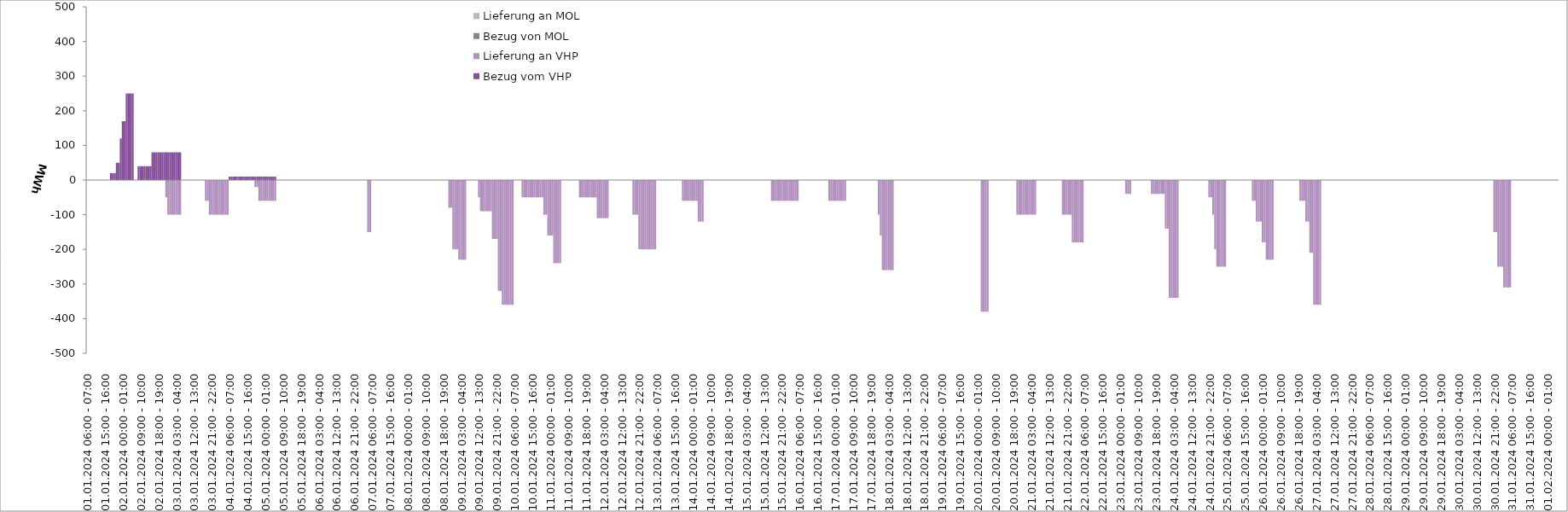
| Category | Bezug vom VHP | Lieferung an VHP | Bezug von MOL | Lieferung an MOL |
|---|---|---|---|---|
| 01.01.2024 06:00 - 07:00 | 0 | 0 | 0 | 0 |
| 01.01.2024 07:00 - 08:00 | 0 | 0 | 0 | 0 |
| 01.01.2024 08:00 - 09:00 | 0 | 0 | 0 | 0 |
| 01.01.2024 09:00 - 10:00 | 0 | 0 | 0 | 0 |
| 01.01.2024 10:00 - 11:00 | 0 | 0 | 0 | 0 |
| 01.01.2024 11:00 - 12:00 | 0 | 0 | 0 | 0 |
| 01.01.2024 12:00 - 13:00 | 0 | 0 | 0 | 0 |
| 01.01.2024 13:00 - 14:00 | 0 | 0 | 0 | 0 |
| 01.01.2024 14:00 - 15:00 | 0 | 0 | 0 | 0 |
| 01.01.2024 15:00 - 16:00 | 0 | 0 | 0 | 0 |
| 01.01.2024 16:00 - 17:00 | 0 | 0 | 0 | 0 |
| 01.01.2024 17:00 - 18:00 | 0 | 0 | 0 | 0 |
| 01.01.2024 18:00 - 19:00 | 20 | 0 | 0 | 0 |
| 01.01.2024 19:00 - 20:00 | 20 | 0 | 0 | 0 |
| 01.01.2024 20:00 - 21:00 | 20 | 0 | 0 | 0 |
| 01.01.2024 21:00 - 22:00 | 50 | 0 | 0 | 0 |
| 01.01.2024 22:00 - 23:00 | 50 | 0 | 0 | 0 |
| 01.01.2024 23:00 - 24:00 | 120 | 0 | 0 | 0 |
| 02.01.2024 00:00 - 01:00 | 170 | 0 | 0 | 0 |
| 02.01.2024 01:00 - 02:00 | 170 | 0 | 0 | 0 |
| 02.01.2024 02:00 - 03:00 | 250 | 0 | 0 | 0 |
| 02.01.2024 03:00 - 04:00 | 250 | 0 | 0 | 0 |
| 02.01.2024 04:00 - 05:00 | 250 | 0 | 0 | 0 |
| 02.01.2024 05:00 - 06:00 | 250 | 0 | 0 | 0 |
| 02.01.2024 06:00 - 07:00 | 0 | 0 | 0 | 0 |
| 02.01.2024 07:00 - 08:00 | 0 | 0 | 0 | 0 |
| 02.01.2024 08:00 - 09:00 | 40 | 0 | 0 | 0 |
| 02.01.2024 09:00 - 10:00 | 40 | 0 | 0 | 0 |
| 02.01.2024 10:00 - 11:00 | 40 | 0 | 0 | 0 |
| 02.01.2024 11:00 - 12:00 | 40 | 0 | 0 | 0 |
| 02.01.2024 12:00 - 13:00 | 40 | 0 | 0 | 0 |
| 02.01.2024 13:00 - 14:00 | 40 | 0 | 0 | 0 |
| 02.01.2024 14:00 - 15:00 | 40 | 0 | 0 | 0 |
| 02.01.2024 15:00 - 16:00 | 80 | 0 | 0 | 0 |
| 02.01.2024 16:00 - 17:00 | 80 | 0 | 0 | 0 |
| 02.01.2024 17:00 - 18:00 | 80 | 0 | 0 | 0 |
| 02.01.2024 18:00 - 19:00 | 80 | 0 | 0 | 0 |
| 02.01.2024 19:00 - 20:00 | 80 | 0 | 0 | 0 |
| 02.01.2024 20:00 - 21:00 | 80 | 0 | 0 | 0 |
| 02.01.2024 21:00 - 22:00 | 80 | 0 | 0 | 0 |
| 02.01.2024 22:00 - 23:00 | 80 | -50 | 0 | 0 |
| 02.01.2024 23:00 - 24:00 | 80 | -100 | 0 | 0 |
| 03.01.2024 00:00 - 01:00 | 80 | -100 | 0 | 0 |
| 03.01.2024 01:00 - 02:00 | 80 | -100 | 0 | 0 |
| 03.01.2024 02:00 - 03:00 | 80 | -100 | 0 | 0 |
| 03.01.2024 03:00 - 04:00 | 80 | -100 | 0 | 0 |
| 03.01.2024 04:00 - 05:00 | 80 | -100 | 0 | 0 |
| 03.01.2024 05:00 - 06:00 | 80 | -100 | 0 | 0 |
| 03.01.2024 06:00 - 07:00 | 0 | 0 | 0 | 0 |
| 03.01.2024 07:00 - 08:00 | 0 | 0 | 0 | 0 |
| 03.01.2024 08:00 - 09:00 | 0 | 0 | 0 | 0 |
| 03.01.2024 09:00 - 10:00 | 0 | 0 | 0 | 0 |
| 03.01.2024 10:00 - 11:00 | 0 | 0 | 0 | 0 |
| 03.01.2024 11:00 - 12:00 | 0 | 0 | 0 | 0 |
| 03.01.2024 12:00 - 13:00 | 0 | 0 | 0 | 0 |
| 03.01.2024 13:00 - 14:00 | 0 | 0 | 0 | 0 |
| 03.01.2024 14:00 - 15:00 | 0 | 0 | 0 | 0 |
| 03.01.2024 15:00 - 16:00 | 0 | 0 | 0 | 0 |
| 03.01.2024 16:00 - 17:00 | 0 | 0 | 0 | 0 |
| 03.01.2024 17:00 - 18:00 | 0 | 0 | 0 | 0 |
| 03.01.2024 18:00 - 19:00 | 0 | -60 | 0 | 0 |
| 03.01.2024 19:00 - 20:00 | 0 | -60 | 0 | 0 |
| 03.01.2024 20:00 - 21:00 | 0 | -100 | 0 | 0 |
| 03.01.2024 21:00 - 22:00 | 0 | -100 | 0 | 0 |
| 03.01.2024 22:00 - 23:00 | 0 | -100 | 0 | 0 |
| 03.01.2024 23:00 - 24:00 | 0 | -100 | 0 | 0 |
| 04.01.2024 00:00 - 01:00 | 0 | -100 | 0 | 0 |
| 04.01.2024 01:00 - 02:00 | 0 | -100 | 0 | 0 |
| 04.01.2024 02:00 - 03:00 | 0 | -100 | 0 | 0 |
| 04.01.2024 03:00 - 04:00 | 0 | -100 | 0 | 0 |
| 04.01.2024 04:00 - 05:00 | 0 | -100 | 0 | 0 |
| 04.01.2024 05:00 - 06:00 | 0 | -100 | 0 | 0 |
| 04.01.2024 06:00 - 07:00 | 10 | 0 | 0 | 0 |
| 04.01.2024 07:00 - 08:00 | 10 | 0 | 0 | 0 |
| 04.01.2024 08:00 - 09:00 | 10 | 0 | 0 | 0 |
| 04.01.2024 09:00 - 10:00 | 10 | 0 | 0 | 0 |
| 04.01.2024 10:00 - 11:00 | 10 | 0 | 0 | 0 |
| 04.01.2024 11:00 - 12:00 | 10 | 0 | 0 | 0 |
| 04.01.2024 12:00 - 13:00 | 10 | 0 | 0 | 0 |
| 04.01.2024 13:00 - 14:00 | 10 | 0 | 0 | 0 |
| 04.01.2024 14:00 - 15:00 | 10 | 0 | 0 | 0 |
| 04.01.2024 15:00 - 16:00 | 10 | 0 | 0 | 0 |
| 04.01.2024 16:00 - 17:00 | 10 | 0 | 0 | 0 |
| 04.01.2024 17:00 - 18:00 | 10 | 0 | 0 | 0 |
| 04.01.2024 18:00 - 19:00 | 10 | 0 | 0 | 0 |
| 04.01.2024 19:00 - 20:00 | 10 | -20 | 0 | 0 |
| 04.01.2024 20:00 - 21:00 | 10 | -20 | 0 | 0 |
| 04.01.2024 21:00 - 22:00 | 10 | -60 | 0 | 0 |
| 04.01.2024 22:00 - 23:00 | 10 | -60 | 0 | 0 |
| 04.01.2024 23:00 - 24:00 | 10 | -60 | 0 | 0 |
| 05.01.2024 00:00 - 01:00 | 10 | -60 | 0 | 0 |
| 05.01.2024 01:00 - 02:00 | 10 | -60 | 0 | 0 |
| 05.01.2024 02:00 - 03:00 | 10 | -60 | 0 | 0 |
| 05.01.2024 03:00 - 04:00 | 10 | -60 | 0 | 0 |
| 05.01.2024 04:00 - 05:00 | 10 | -60 | 0 | 0 |
| 05.01.2024 05:00 - 06:00 | 10 | -60 | 0 | 0 |
| 05.01.2024 06:00 - 07:00 | 0 | 0 | 0 | 0 |
| 05.01.2024 07:00 - 08:00 | 0 | 0 | 0 | 0 |
| 05.01.2024 08:00 - 09:00 | 0 | 0 | 0 | 0 |
| 05.01.2024 09:00 - 10:00 | 0 | 0 | 0 | 0 |
| 05.01.2024 10:00 - 11:00 | 0 | 0 | 0 | 0 |
| 05.01.2024 11:00 - 12:00 | 0 | 0 | 0 | 0 |
| 05.01.2024 12:00 - 13:00 | 0 | 0 | 0 | 0 |
| 05.01.2024 13:00 - 14:00 | 0 | 0 | 0 | 0 |
| 05.01.2024 14:00 - 15:00 | 0 | 0 | 0 | 0 |
| 05.01.2024 15:00 - 16:00 | 0 | 0 | 0 | 0 |
| 05.01.2024 16:00 - 17:00 | 0 | 0 | 0 | 0 |
| 05.01.2024 17:00 - 18:00 | 0 | 0 | 0 | 0 |
| 05.01.2024 18:00 - 19:00 | 0 | 0 | 0 | 0 |
| 05.01.2024 19:00 - 20:00 | 0 | 0 | 0 | 0 |
| 05.01.2024 20:00 - 21:00 | 0 | 0 | 0 | 0 |
| 05.01.2024 21:00 - 22:00 | 0 | 0 | 0 | 0 |
| 05.01.2024 22:00 - 23:00 | 0 | 0 | 0 | 0 |
| 05.01.2024 23:00 - 24:00 | 0 | 0 | 0 | 0 |
| 06.01.2024 00:00 - 01:00 | 0 | 0 | 0 | 0 |
| 06.01.2024 01:00 - 02:00 | 0 | 0 | 0 | 0 |
| 06.01.2024 02:00 - 03:00 | 0 | 0 | 0 | 0 |
| 06.01.2024 03:00 - 04:00 | 0 | 0 | 0 | 0 |
| 06.01.2024 04:00 - 05:00 | 0 | 0 | 0 | 0 |
| 06.01.2024 05:00 - 06:00 | 0 | 0 | 0 | 0 |
| 06.01.2024 06:00 - 07:00 | 0 | 0 | 0 | 0 |
| 06.01.2024 07:00 - 08:00 | 0 | 0 | 0 | 0 |
| 06.01.2024 08:00 - 09:00 | 0 | 0 | 0 | 0 |
| 06.01.2024 09:00 - 10:00 | 0 | 0 | 0 | 0 |
| 06.01.2024 10:00 - 11:00 | 0 | 0 | 0 | 0 |
| 06.01.2024 11:00 - 12:00 | 0 | 0 | 0 | 0 |
| 06.01.2024 12:00 - 13:00 | 0 | 0 | 0 | 0 |
| 06.01.2024 13:00 - 14:00 | 0 | 0 | 0 | 0 |
| 06.01.2024 14:00 - 15:00 | 0 | 0 | 0 | 0 |
| 06.01.2024 15:00 - 16:00 | 0 | 0 | 0 | 0 |
| 06.01.2024 16:00 - 17:00 | 0 | 0 | 0 | 0 |
| 06.01.2024 17:00 - 18:00 | 0 | 0 | 0 | 0 |
| 06.01.2024 18:00 - 19:00 | 0 | 0 | 0 | 0 |
| 06.01.2024 19:00 - 20:00 | 0 | 0 | 0 | 0 |
| 06.01.2024 20:00 - 21:00 | 0 | 0 | 0 | 0 |
| 06.01.2024 21:00 - 22:00 | 0 | 0 | 0 | 0 |
| 06.01.2024 22:00 - 23:00 | 0 | 0 | 0 | 0 |
| 06.01.2024 23:00 - 24:00 | 0 | 0 | 0 | 0 |
| 07.01.2024 00:00 - 01:00 | 0 | 0 | 0 | 0 |
| 07.01.2024 01:00 - 02:00 | 0 | 0 | 0 | 0 |
| 07.01.2024 02:00 - 03:00 | 0 | 0 | 0 | 0 |
| 07.01.2024 03:00 - 04:00 | 0 | 0 | 0 | 0 |
| 07.01.2024 04:00 - 05:00 | 0 | -150 | 0 | 0 |
| 07.01.2024 05:00 - 06:00 | 0 | -150 | 0 | 0 |
| 07.01.2024 06:00 - 07:00 | 0 | 0 | 0 | 0 |
| 07.01.2024 07:00 - 08:00 | 0 | 0 | 0 | 0 |
| 07.01.2024 08:00 - 09:00 | 0 | 0 | 0 | 0 |
| 07.01.2024 09:00 - 10:00 | 0 | 0 | 0 | 0 |
| 07.01.2024 10:00 - 11:00 | 0 | 0 | 0 | 0 |
| 07.01.2024 11:00 - 12:00 | 0 | 0 | 0 | 0 |
| 07.01.2024 12:00 - 13:00 | 0 | 0 | 0 | 0 |
| 07.01.2024 13:00 - 14:00 | 0 | 0 | 0 | 0 |
| 07.01.2024 14:00 - 15:00 | 0 | 0 | 0 | 0 |
| 07.01.2024 15:00 - 16:00 | 0 | 0 | 0 | 0 |
| 07.01.2024 16:00 - 17:00 | 0 | 0 | 0 | 0 |
| 07.01.2024 17:00 - 18:00 | 0 | 0 | 0 | 0 |
| 07.01.2024 18:00 - 19:00 | 0 | 0 | 0 | 0 |
| 07.01.2024 19:00 - 20:00 | 0 | 0 | 0 | 0 |
| 07.01.2024 20:00 - 21:00 | 0 | 0 | 0 | 0 |
| 07.01.2024 21:00 - 22:00 | 0 | 0 | 0 | 0 |
| 07.01.2024 22:00 - 23:00 | 0 | 0 | 0 | 0 |
| 07.01.2024 23:00 - 24:00 | 0 | 0 | 0 | 0 |
| 08.01.2024 00:00 - 01:00 | 0 | 0 | 0 | 0 |
| 08.01.2024 01:00 - 02:00 | 0 | 0 | 0 | 0 |
| 08.01.2024 02:00 - 03:00 | 0 | 0 | 0 | 0 |
| 08.01.2024 03:00 - 04:00 | 0 | 0 | 0 | 0 |
| 08.01.2024 04:00 - 05:00 | 0 | 0 | 0 | 0 |
| 08.01.2024 05:00 - 06:00 | 0 | 0 | 0 | 0 |
| 08.01.2024 06:00 - 07:00 | 0 | 0 | 0 | 0 |
| 08.01.2024 07:00 - 08:00 | 0 | 0 | 0 | 0 |
| 08.01.2024 08:00 - 09:00 | 0 | 0 | 0 | 0 |
| 08.01.2024 09:00 - 10:00 | 0 | 0 | 0 | 0 |
| 08.01.2024 10:00 - 11:00 | 0 | 0 | 0 | 0 |
| 08.01.2024 11:00 - 12:00 | 0 | 0 | 0 | 0 |
| 08.01.2024 12:00 - 13:00 | 0 | 0 | 0 | 0 |
| 08.01.2024 13:00 - 14:00 | 0 | 0 | 0 | 0 |
| 08.01.2024 14:00 - 15:00 | 0 | 0 | 0 | 0 |
| 08.01.2024 15:00 - 16:00 | 0 | 0 | 0 | 0 |
| 08.01.2024 16:00 - 17:00 | 0 | 0 | 0 | 0 |
| 08.01.2024 17:00 - 18:00 | 0 | 0 | 0 | 0 |
| 08.01.2024 18:00 - 19:00 | 0 | 0 | 0 | 0 |
| 08.01.2024 19:00 - 20:00 | 0 | 0 | 0 | 0 |
| 08.01.2024 20:00 - 21:00 | 0 | 0 | 0 | 0 |
| 08.01.2024 21:00 - 22:00 | 0 | -80 | 0 | 0 |
| 08.01.2024 22:00 - 23:00 | 0 | -80 | 0 | 0 |
| 08.01.2024 23:00 - 24:00 | 0 | -200 | 0 | 0 |
| 09.01.2024 00:00 - 01:00 | 0 | -200 | 0 | 0 |
| 09.01.2024 01:00 - 02:00 | 0 | -200 | 0 | 0 |
| 09.01.2024 02:00 - 03:00 | 0 | -230 | 0 | 0 |
| 09.01.2024 03:00 - 04:00 | 0 | -230 | 0 | 0 |
| 09.01.2024 04:00 - 05:00 | 0 | -230 | 0 | 0 |
| 09.01.2024 05:00 - 06:00 | 0 | -230 | 0 | 0 |
| 09.01.2024 06:00 - 07:00 | 0 | 0 | 0 | 0 |
| 09.01.2024 07:00 - 08:00 | 0 | 0 | 0 | 0 |
| 09.01.2024 08:00 - 09:00 | 0 | 0 | 0 | 0 |
| 09.01.2024 09:00 - 10:00 | 0 | 0 | 0 | 0 |
| 09.01.2024 10:00 - 11:00 | 0 | 0 | 0 | 0 |
| 09.01.2024 11:00 - 12:00 | 0 | 0 | 0 | 0 |
| 09.01.2024 12:00 - 13:00 | 0 | -50 | 0 | 0 |
| 09.01.2024 13:00 - 14:00 | 0 | -90 | 0 | 0 |
| 09.01.2024 14:00 - 15:00 | 0 | -90 | 0 | 0 |
| 09.01.2024 15:00 - 16:00 | 0 | -90 | 0 | 0 |
| 09.01.2024 16:00 - 17:00 | 0 | -90 | 0 | 0 |
| 09.01.2024 17:00 - 18:00 | 0 | -90 | 0 | 0 |
| 09.01.2024 18:00 - 19:00 | 0 | -90 | 0 | 0 |
| 09.01.2024 19:00 - 20:00 | 0 | -170 | 0 | 0 |
| 09.01.2024 20:00 - 21:00 | 0 | -170 | 0 | 0 |
| 09.01.2024 21:00 - 22:00 | 0 | -170 | 0 | 0 |
| 09.01.2024 22:00 - 23:00 | 0 | -320 | 0 | 0 |
| 09.01.2024 23:00 - 24:00 | 0 | -320 | 0 | 0 |
| 10.01.2024 00:00 - 01:00 | 0 | -360 | 0 | 0 |
| 10.01.2024 01:00 - 02:00 | 0 | -360 | 0 | 0 |
| 10.01.2024 02:00 - 03:00 | 0 | -360 | 0 | 0 |
| 10.01.2024 03:00 - 04:00 | 0 | -360 | 0 | 0 |
| 10.01.2024 04:00 - 05:00 | 0 | -360 | 0 | 0 |
| 10.01.2024 05:00 - 06:00 | 0 | -360 | 0 | 0 |
| 10.01.2024 06:00 - 07:00 | 0 | 0 | 0 | 0 |
| 10.01.2024 07:00 - 08:00 | 0 | 0 | 0 | 0 |
| 10.01.2024 08:00 - 09:00 | 0 | 0 | 0 | 0 |
| 10.01.2024 09:00 - 10:00 | 0 | 0 | 0 | 0 |
| 10.01.2024 10:00 - 11:00 | 0 | -50 | 0 | 0 |
| 10.01.2024 11:00 - 12:00 | 0 | -50 | 0 | 0 |
| 10.01.2024 12:00 - 13:00 | 0 | -50 | 0 | 0 |
| 10.01.2024 13:00 - 14:00 | 0 | -50 | 0 | 0 |
| 10.01.2024 14:00 - 15:00 | 0 | -50 | 0 | 0 |
| 10.01.2024 15:00 - 16:00 | 0 | -50 | 0 | 0 |
| 10.01.2024 16:00 - 17:00 | 0 | -50 | 0 | 0 |
| 10.01.2024 17:00 - 18:00 | 0 | -50 | 0 | 0 |
| 10.01.2024 18:00 - 19:00 | 0 | -50 | 0 | 0 |
| 10.01.2024 19:00 - 20:00 | 0 | -50 | 0 | 0 |
| 10.01.2024 20:00 - 21:00 | 0 | -50 | 0 | 0 |
| 10.01.2024 21:00 - 22:00 | 0 | -100 | 0 | 0 |
| 10.01.2024 22:00 - 23:00 | 0 | -100 | 0 | 0 |
| 10.01.2024 23:00 - 24:00 | 0 | -160 | 0 | 0 |
| 11.01.2024 00:00 - 01:00 | 0 | -160 | 0 | 0 |
| 11.01.2024 01:00 - 02:00 | 0 | -160 | 0 | 0 |
| 11.01.2024 02:00 - 03:00 | 0 | -240 | 0 | 0 |
| 11.01.2024 03:00 - 04:00 | 0 | -240 | 0 | 0 |
| 11.01.2024 04:00 - 05:00 | 0 | -240 | 0 | 0 |
| 11.01.2024 05:00 - 06:00 | 0 | -240 | 0 | 0 |
| 11.01.2024 06:00 - 07:00 | 0 | 0 | 0 | 0 |
| 11.01.2024 07:00 - 08:00 | 0 | 0 | 0 | 0 |
| 11.01.2024 08:00 - 09:00 | 0 | 0 | 0 | 0 |
| 11.01.2024 09:00 - 10:00 | 0 | 0 | 0 | 0 |
| 11.01.2024 10:00 - 11:00 | 0 | 0 | 0 | 0 |
| 11.01.2024 11:00 - 12:00 | 0 | 0 | 0 | 0 |
| 11.01.2024 12:00 - 13:00 | 0 | 0 | 0 | 0 |
| 11.01.2024 13:00 - 14:00 | 0 | 0 | 0 | 0 |
| 11.01.2024 14:00 - 15:00 | 0 | 0 | 0 | 0 |
| 11.01.2024 15:00 - 16:00 | 0 | -50 | 0 | 0 |
| 11.01.2024 16:00 - 17:00 | 0 | -50 | 0 | 0 |
| 11.01.2024 17:00 - 18:00 | 0 | -50 | 0 | 0 |
| 11.01.2024 18:00 - 19:00 | 0 | -50 | 0 | 0 |
| 11.01.2024 19:00 - 20:00 | 0 | -50 | 0 | 0 |
| 11.01.2024 20:00 - 21:00 | 0 | -50 | 0 | 0 |
| 11.01.2024 21:00 - 22:00 | 0 | -50 | 0 | 0 |
| 11.01.2024 22:00 - 23:00 | 0 | -50 | 0 | 0 |
| 11.01.2024 23:00 - 24:00 | 0 | -50 | 0 | 0 |
| 12.01.2024 00:00 - 01:00 | 0 | -110 | 0 | 0 |
| 12.01.2024 01:00 - 02:00 | 0 | -110 | 0 | 0 |
| 12.01.2024 02:00 - 03:00 | 0 | -110 | 0 | 0 |
| 12.01.2024 03:00 - 04:00 | 0 | -110 | 0 | 0 |
| 12.01.2024 04:00 - 05:00 | 0 | -110 | 0 | 0 |
| 12.01.2024 05:00 - 06:00 | 0 | -110 | 0 | 0 |
| 12.01.2024 06:00 - 07:00 | 0 | 0 | 0 | 0 |
| 12.01.2024 07:00 - 08:00 | 0 | 0 | 0 | 0 |
| 12.01.2024 08:00 - 09:00 | 0 | 0 | 0 | 0 |
| 12.01.2024 09:00 - 10:00 | 0 | 0 | 0 | 0 |
| 12.01.2024 10:00 - 11:00 | 0 | 0 | 0 | 0 |
| 12.01.2024 11:00 - 12:00 | 0 | 0 | 0 | 0 |
| 12.01.2024 12:00 - 13:00 | 0 | 0 | 0 | 0 |
| 12.01.2024 13:00 - 14:00 | 0 | 0 | 0 | 0 |
| 12.01.2024 14:00 - 15:00 | 0 | 0 | 0 | 0 |
| 12.01.2024 15:00 - 16:00 | 0 | 0 | 0 | 0 |
| 12.01.2024 16:00 - 17:00 | 0 | 0 | 0 | 0 |
| 12.01.2024 17:00 - 18:00 | 0 | 0 | 0 | 0 |
| 12.01.2024 18:00 - 19:00 | 0 | -100 | 0 | 0 |
| 12.01.2024 19:00 - 20:00 | 0 | -100 | 0 | 0 |
| 12.01.2024 20:00 - 21:00 | 0 | -100 | 0 | 0 |
| 12.01.2024 21:00 - 22:00 | 0 | -200 | 0 | 0 |
| 12.01.2024 22:00 - 23:00 | 0 | -200 | 0 | 0 |
| 12.01.2024 23:00 - 24:00 | 0 | -200 | 0 | 0 |
| 13.01.2024 00:00 - 01:00 | 0 | -200 | 0 | 0 |
| 13.01.2024 01:00 - 02:00 | 0 | -200 | 0 | 0 |
| 13.01.2024 02:00 - 03:00 | 0 | -200 | 0 | 0 |
| 13.01.2024 03:00 - 04:00 | 0 | -200 | 0 | 0 |
| 13.01.2024 04:00 - 05:00 | 0 | -200 | 0 | 0 |
| 13.01.2024 05:00 - 06:00 | 0 | -200 | 0 | 0 |
| 13.01.2024 06:00 - 07:00 | 0 | 0 | 0 | 0 |
| 13.01.2024 07:00 - 08:00 | 0 | 0 | 0 | 0 |
| 13.01.2024 08:00 - 09:00 | 0 | 0 | 0 | 0 |
| 13.01.2024 09:00 - 10:00 | 0 | 0 | 0 | 0 |
| 13.01.2024 10:00 - 11:00 | 0 | 0 | 0 | 0 |
| 13.01.2024 11:00 - 12:00 | 0 | 0 | 0 | 0 |
| 13.01.2024 12:00 - 13:00 | 0 | 0 | 0 | 0 |
| 13.01.2024 13:00 - 14:00 | 0 | 0 | 0 | 0 |
| 13.01.2024 14:00 - 15:00 | 0 | 0 | 0 | 0 |
| 13.01.2024 15:00 - 16:00 | 0 | 0 | 0 | 0 |
| 13.01.2024 16:00 - 17:00 | 0 | 0 | 0 | 0 |
| 13.01.2024 17:00 - 18:00 | 0 | 0 | 0 | 0 |
| 13.01.2024 18:00 - 19:00 | 0 | 0 | 0 | 0 |
| 13.01.2024 19:00 - 20:00 | 0 | -60 | 0 | 0 |
| 13.01.2024 20:00 - 21:00 | 0 | -60 | 0 | 0 |
| 13.01.2024 21:00 - 22:00 | 0 | -60 | 0 | 0 |
| 13.01.2024 22:00 - 23:00 | 0 | -60 | 0 | 0 |
| 13.01.2024 23:00 - 24:00 | 0 | -60 | 0 | 0 |
| 14.01.2024 00:00 - 01:00 | 0 | -60 | 0 | 0 |
| 14.01.2024 01:00 - 02:00 | 0 | -60 | 0 | 0 |
| 14.01.2024 02:00 - 03:00 | 0 | -60 | 0 | 0 |
| 14.01.2024 03:00 - 04:00 | 0 | -120 | 0 | 0 |
| 14.01.2024 04:00 - 05:00 | 0 | -120 | 0 | 0 |
| 14.01.2024 05:00 - 06:00 | 0 | -120 | 0 | 0 |
| 14.01.2024 06:00 - 07:00 | 0 | 0 | 0 | 0 |
| 14.01.2024 07:00 - 08:00 | 0 | 0 | 0 | 0 |
| 14.01.2024 08:00 - 09:00 | 0 | 0 | 0 | 0 |
| 14.01.2024 09:00 - 10:00 | 0 | 0 | 0 | 0 |
| 14.01.2024 10:00 - 11:00 | 0 | 0 | 0 | 0 |
| 14.01.2024 11:00 - 12:00 | 0 | 0 | 0 | 0 |
| 14.01.2024 12:00 - 13:00 | 0 | 0 | 0 | 0 |
| 14.01.2024 13:00 - 14:00 | 0 | 0 | 0 | 0 |
| 14.01.2024 14:00 - 15:00 | 0 | 0 | 0 | 0 |
| 14.01.2024 15:00 - 16:00 | 0 | 0 | 0 | 0 |
| 14.01.2024 16:00 - 17:00 | 0 | 0 | 0 | 0 |
| 14.01.2024 17:00 - 18:00 | 0 | 0 | 0 | 0 |
| 14.01.2024 18:00 - 19:00 | 0 | 0 | 0 | 0 |
| 14.01.2024 19:00 - 20:00 | 0 | 0 | 0 | 0 |
| 14.01.2024 20:00 - 21:00 | 0 | 0 | 0 | 0 |
| 14.01.2024 21:00 - 22:00 | 0 | 0 | 0 | 0 |
| 14.01.2024 22:00 - 23:00 | 0 | 0 | 0 | 0 |
| 14.01.2024 23:00 - 24:00 | 0 | 0 | 0 | 0 |
| 15.01.2024 00:00 - 01:00 | 0 | 0 | 0 | 0 |
| 15.01.2024 01:00 - 02:00 | 0 | 0 | 0 | 0 |
| 15.01.2024 02:00 - 03:00 | 0 | 0 | 0 | 0 |
| 15.01.2024 03:00 - 04:00 | 0 | 0 | 0 | 0 |
| 15.01.2024 04:00 - 05:00 | 0 | 0 | 0 | 0 |
| 15.01.2024 05:00 - 06:00 | 0 | 0 | 0 | 0 |
| 15.01.2024 06:00 - 07:00 | 0 | 0 | 0 | 0 |
| 15.01.2024 07:00 - 08:00 | 0 | 0 | 0 | 0 |
| 15.01.2024 08:00 - 09:00 | 0 | 0 | 0 | 0 |
| 15.01.2024 09:00 - 10:00 | 0 | 0 | 0 | 0 |
| 15.01.2024 10:00 - 11:00 | 0 | 0 | 0 | 0 |
| 15.01.2024 11:00 - 12:00 | 0 | 0 | 0 | 0 |
| 15.01.2024 12:00 - 13:00 | 0 | 0 | 0 | 0 |
| 15.01.2024 13:00 - 14:00 | 0 | 0 | 0 | 0 |
| 15.01.2024 14:00 - 15:00 | 0 | 0 | 0 | 0 |
| 15.01.2024 15:00 - 16:00 | 0 | 0 | 0 | 0 |
| 15.01.2024 16:00 - 17:00 | 0 | -60 | 0 | 0 |
| 15.01.2024 17:00 - 18:00 | 0 | -60 | 0 | 0 |
| 15.01.2024 18:00 - 19:00 | 0 | -60 | 0 | 0 |
| 15.01.2024 19:00 - 20:00 | 0 | -60 | 0 | 0 |
| 15.01.2024 20:00 - 21:00 | 0 | -60 | 0 | 0 |
| 15.01.2024 21:00 - 22:00 | 0 | -60 | 0 | 0 |
| 15.01.2024 22:00 - 23:00 | 0 | -60 | 0 | 0 |
| 15.01.2024 23:00 - 24:00 | 0 | -60 | 0 | 0 |
| 16.01.2024 00:00 - 01:00 | 0 | -60 | 0 | 0 |
| 16.01.2024 01:00 - 02:00 | 0 | -60 | 0 | 0 |
| 16.01.2024 02:00 - 03:00 | 0 | -60 | 0 | 0 |
| 16.01.2024 03:00 - 04:00 | 0 | -60 | 0 | 0 |
| 16.01.2024 04:00 - 05:00 | 0 | -60 | 0 | 0 |
| 16.01.2024 05:00 - 06:00 | 0 | -60 | 0 | 0 |
| 16.01.2024 06:00 - 07:00 | 0 | 0 | 0 | 0 |
| 16.01.2024 07:00 - 08:00 | 0 | 0 | 0 | 0 |
| 16.01.2024 08:00 - 09:00 | 0 | 0 | 0 | 0 |
| 16.01.2024 09:00 - 10:00 | 0 | 0 | 0 | 0 |
| 16.01.2024 10:00 - 11:00 | 0 | 0 | 0 | 0 |
| 16.01.2024 11:00 - 12:00 | 0 | 0 | 0 | 0 |
| 16.01.2024 12:00 - 13:00 | 0 | 0 | 0 | 0 |
| 16.01.2024 13:00 - 14:00 | 0 | 0 | 0 | 0 |
| 16.01.2024 14:00 - 15:00 | 0 | 0 | 0 | 0 |
| 16.01.2024 15:00 - 16:00 | 0 | 0 | 0 | 0 |
| 16.01.2024 16:00 - 17:00 | 0 | 0 | 0 | 0 |
| 16.01.2024 17:00 - 18:00 | 0 | 0 | 0 | 0 |
| 16.01.2024 18:00 - 19:00 | 0 | 0 | 0 | 0 |
| 16.01.2024 19:00 - 20:00 | 0 | 0 | 0 | 0 |
| 16.01.2024 20:00 - 21:00 | 0 | 0 | 0 | 0 |
| 16.01.2024 21:00 - 22:00 | 0 | -60 | 0 | 0 |
| 16.01.2024 22:00 - 23:00 | 0 | -60 | 0 | 0 |
| 16.01.2024 23:00 - 24:00 | 0 | -60 | 0 | 0 |
| 17.01.2024 00:00 - 01:00 | 0 | -60 | 0 | 0 |
| 17.01.2024 01:00 - 02:00 | 0 | -60 | 0 | 0 |
| 17.01.2024 02:00 - 03:00 | 0 | -60 | 0 | 0 |
| 17.01.2024 03:00 - 04:00 | 0 | -60 | 0 | 0 |
| 17.01.2024 04:00 - 05:00 | 0 | -60 | 0 | 0 |
| 17.01.2024 05:00 - 06:00 | 0 | -60 | 0 | 0 |
| 17.01.2024 06:00 - 07:00 | 0 | 0 | 0 | 0 |
| 17.01.2024 07:00 - 08:00 | 0 | 0 | 0 | 0 |
| 17.01.2024 08:00 - 09:00 | 0 | 0 | 0 | 0 |
| 17.01.2024 09:00 - 10:00 | 0 | 0 | 0 | 0 |
| 17.01.2024 10:00 - 11:00 | 0 | 0 | 0 | 0 |
| 17.01.2024 11:00 - 12:00 | 0 | 0 | 0 | 0 |
| 17.01.2024 12:00 - 13:00 | 0 | 0 | 0 | 0 |
| 17.01.2024 13:00 - 14:00 | 0 | 0 | 0 | 0 |
| 17.01.2024 14:00 - 15:00 | 0 | 0 | 0 | 0 |
| 17.01.2024 15:00 - 16:00 | 0 | 0 | 0 | 0 |
| 17.01.2024 16:00 - 17:00 | 0 | 0 | 0 | 0 |
| 17.01.2024 17:00 - 18:00 | 0 | 0 | 0 | 0 |
| 17.01.2024 18:00 - 19:00 | 0 | 0 | 0 | 0 |
| 17.01.2024 19:00 - 20:00 | 0 | 0 | 0 | 0 |
| 17.01.2024 20:00 - 21:00 | 0 | 0 | 0 | 0 |
| 17.01.2024 21:00 - 22:00 | 0 | 0 | 0 | 0 |
| 17.01.2024 22:00 - 23:00 | 0 | -100 | 0 | 0 |
| 17.01.2024 23:00 - 24:00 | 0 | -160 | 0 | 0 |
| 18.01.2024 00:00 - 01:00 | 0 | -260 | 0 | 0 |
| 18.01.2024 01:00 - 02:00 | 0 | -260 | 0 | 0 |
| 18.01.2024 02:00 - 03:00 | 0 | -260 | 0 | 0 |
| 18.01.2024 03:00 - 04:00 | 0 | -260 | 0 | 0 |
| 18.01.2024 04:00 - 05:00 | 0 | -260 | 0 | 0 |
| 18.01.2024 05:00 - 06:00 | 0 | -260 | 0 | 0 |
| 18.01.2024 06:00 - 07:00 | 0 | 0 | 0 | 0 |
| 18.01.2024 07:00 - 08:00 | 0 | 0 | 0 | 0 |
| 18.01.2024 08:00 - 09:00 | 0 | 0 | 0 | 0 |
| 18.01.2024 09:00 - 10:00 | 0 | 0 | 0 | 0 |
| 18.01.2024 10:00 - 11:00 | 0 | 0 | 0 | 0 |
| 18.01.2024 11:00 - 12:00 | 0 | 0 | 0 | 0 |
| 18.01.2024 12:00 - 13:00 | 0 | 0 | 0 | 0 |
| 18.01.2024 13:00 - 14:00 | 0 | 0 | 0 | 0 |
| 18.01.2024 14:00 - 15:00 | 0 | 0 | 0 | 0 |
| 18.01.2024 15:00 - 16:00 | 0 | 0 | 0 | 0 |
| 18.01.2024 16:00 - 17:00 | 0 | 0 | 0 | 0 |
| 18.01.2024 17:00 - 18:00 | 0 | 0 | 0 | 0 |
| 18.01.2024 18:00 - 19:00 | 0 | 0 | 0 | 0 |
| 18.01.2024 19:00 - 20:00 | 0 | 0 | 0 | 0 |
| 18.01.2024 20:00 - 21:00 | 0 | 0 | 0 | 0 |
| 18.01.2024 21:00 - 22:00 | 0 | 0 | 0 | 0 |
| 18.01.2024 22:00 - 23:00 | 0 | 0 | 0 | 0 |
| 18.01.2024 23:00 - 24:00 | 0 | 0 | 0 | 0 |
| 19.01.2024 00:00 - 01:00 | 0 | 0 | 0 | 0 |
| 19.01.2024 01:00 - 02:00 | 0 | 0 | 0 | 0 |
| 19.01.2024 02:00 - 03:00 | 0 | 0 | 0 | 0 |
| 19.01.2024 03:00 - 04:00 | 0 | 0 | 0 | 0 |
| 19.01.2024 04:00 - 05:00 | 0 | 0 | 0 | 0 |
| 19.01.2024 05:00 - 06:00 | 0 | 0 | 0 | 0 |
| 19.01.2024 06:00 - 07:00 | 0 | 0 | 0 | 0 |
| 19.01.2024 07:00 - 08:00 | 0 | 0 | 0 | 0 |
| 19.01.2024 08:00 - 09:00 | 0 | 0 | 0 | 0 |
| 19.01.2024 09:00 - 10:00 | 0 | 0 | 0 | 0 |
| 19.01.2024 10:00 - 11:00 | 0 | 0 | 0 | 0 |
| 19.01.2024 11:00 - 12:00 | 0 | 0 | 0 | 0 |
| 19.01.2024 12:00 - 13:00 | 0 | 0 | 0 | 0 |
| 19.01.2024 13:00 - 14:00 | 0 | 0 | 0 | 0 |
| 19.01.2024 14:00 - 15:00 | 0 | 0 | 0 | 0 |
| 19.01.2024 15:00 - 16:00 | 0 | 0 | 0 | 0 |
| 19.01.2024 16:00 - 17:00 | 0 | 0 | 0 | 0 |
| 19.01.2024 17:00 - 18:00 | 0 | 0 | 0 | 0 |
| 19.01.2024 18:00 - 19:00 | 0 | 0 | 0 | 0 |
| 19.01.2024 19:00 - 20:00 | 0 | 0 | 0 | 0 |
| 19.01.2024 20:00 - 21:00 | 0 | 0 | 0 | 0 |
| 19.01.2024 21:00 - 22:00 | 0 | 0 | 0 | 0 |
| 19.01.2024 22:00 - 23:00 | 0 | 0 | 0 | 0 |
| 19.01.2024 23:00 - 24:00 | 0 | 0 | 0 | 0 |
| 20.01.2024 00:00 - 01:00 | 0 | 0 | 0 | 0 |
| 20.01.2024 01:00 - 02:00 | 0 | 0 | 0 | 0 |
| 20.01.2024 02:00 - 03:00 | 0 | -380 | 0 | 0 |
| 20.01.2024 03:00 - 04:00 | 0 | -380 | 0 | 0 |
| 20.01.2024 04:00 - 05:00 | 0 | -380 | 0 | 0 |
| 20.01.2024 05:00 - 06:00 | 0 | -380 | 0 | 0 |
| 20.01.2024 06:00 - 07:00 | 0 | 0 | 0 | 0 |
| 20.01.2024 07:00 - 08:00 | 0 | 0 | 0 | 0 |
| 20.01.2024 08:00 - 09:00 | 0 | 0 | 0 | 0 |
| 20.01.2024 09:00 - 10:00 | 0 | 0 | 0 | 0 |
| 20.01.2024 10:00 - 11:00 | 0 | 0 | 0 | 0 |
| 20.01.2024 11:00 - 12:00 | 0 | 0 | 0 | 0 |
| 20.01.2024 12:00 - 13:00 | 0 | 0 | 0 | 0 |
| 20.01.2024 13:00 - 14:00 | 0 | 0 | 0 | 0 |
| 20.01.2024 14:00 - 15:00 | 0 | 0 | 0 | 0 |
| 20.01.2024 15:00 - 16:00 | 0 | 0 | 0 | 0 |
| 20.01.2024 16:00 - 17:00 | 0 | 0 | 0 | 0 |
| 20.01.2024 17:00 - 18:00 | 0 | 0 | 0 | 0 |
| 20.01.2024 18:00 - 19:00 | 0 | 0 | 0 | 0 |
| 20.01.2024 19:00 - 20:00 | 0 | 0 | 0 | 0 |
| 20.01.2024 20:00 - 21:00 | 0 | -100 | 0 | 0 |
| 20.01.2024 21:00 - 22:00 | 0 | -100 | 0 | 0 |
| 20.01.2024 22:00 - 23:00 | 0 | -100 | 0 | 0 |
| 20.01.2024 23:00 - 24:00 | 0 | -100 | 0 | 0 |
| 21.01.2024 00:00 - 01:00 | 0 | -100 | 0 | 0 |
| 21.01.2024 01:00 - 02:00 | 0 | -100 | 0 | 0 |
| 21.01.2024 02:00 - 03:00 | 0 | -100 | 0 | 0 |
| 21.01.2024 03:00 - 04:00 | 0 | -100 | 0 | 0 |
| 21.01.2024 04:00 - 05:00 | 0 | -100 | 0 | 0 |
| 21.01.2024 05:00 - 06:00 | 0 | -100 | 0 | 0 |
| 21.01.2024 06:00 - 07:00 | 0 | 0 | 0 | 0 |
| 21.01.2024 07:00 - 08:00 | 0 | 0 | 0 | 0 |
| 21.01.2024 08:00 - 09:00 | 0 | 0 | 0 | 0 |
| 21.01.2024 09:00 - 10:00 | 0 | 0 | 0 | 0 |
| 21.01.2024 10:00 - 11:00 | 0 | 0 | 0 | 0 |
| 21.01.2024 11:00 - 12:00 | 0 | 0 | 0 | 0 |
| 21.01.2024 12:00 - 13:00 | 0 | 0 | 0 | 0 |
| 21.01.2024 13:00 - 14:00 | 0 | 0 | 0 | 0 |
| 21.01.2024 14:00 - 15:00 | 0 | 0 | 0 | 0 |
| 21.01.2024 15:00 - 16:00 | 0 | 0 | 0 | 0 |
| 21.01.2024 16:00 - 17:00 | 0 | 0 | 0 | 0 |
| 21.01.2024 17:00 - 18:00 | 0 | 0 | 0 | 0 |
| 21.01.2024 18:00 - 19:00 | 0 | 0 | 0 | 0 |
| 21.01.2024 19:00 - 20:00 | 0 | -100 | 0 | 0 |
| 21.01.2024 20:00 - 21:00 | 0 | -100 | 0 | 0 |
| 21.01.2024 21:00 - 22:00 | 0 | -100 | 0 | 0 |
| 21.01.2024 22:00 - 23:00 | 0 | -100 | 0 | 0 |
| 21.01.2024 23:00 - 24:00 | 0 | -100 | 0 | 0 |
| 22.01.2024 00:00 - 01:00 | 0 | -180 | 0 | 0 |
| 22.01.2024 01:00 - 02:00 | 0 | -180 | 0 | 0 |
| 22.01.2024 02:00 - 03:00 | 0 | -180 | 0 | 0 |
| 22.01.2024 03:00 - 04:00 | 0 | -180 | 0 | 0 |
| 22.01.2024 04:00 - 05:00 | 0 | -180 | 0 | 0 |
| 22.01.2024 05:00 - 06:00 | 0 | -180 | 0 | 0 |
| 22.01.2024 06:00 - 07:00 | 0 | 0 | 0 | 0 |
| 22.01.2024 07:00 - 08:00 | 0 | 0 | 0 | 0 |
| 22.01.2024 08:00 - 09:00 | 0 | 0 | 0 | 0 |
| 22.01.2024 09:00 - 10:00 | 0 | 0 | 0 | 0 |
| 22.01.2024 10:00 - 11:00 | 0 | 0 | 0 | 0 |
| 22.01.2024 11:00 - 12:00 | 0 | 0 | 0 | 0 |
| 22.01.2024 12:00 - 13:00 | 0 | 0 | 0 | 0 |
| 22.01.2024 13:00 - 14:00 | 0 | 0 | 0 | 0 |
| 22.01.2024 14:00 - 15:00 | 0 | 0 | 0 | 0 |
| 22.01.2024 15:00 - 16:00 | 0 | 0 | 0 | 0 |
| 22.01.2024 16:00 - 17:00 | 0 | 0 | 0 | 0 |
| 22.01.2024 17:00 - 18:00 | 0 | 0 | 0 | 0 |
| 22.01.2024 18:00 - 19:00 | 0 | 0 | 0 | 0 |
| 22.01.2024 19:00 - 20:00 | 0 | 0 | 0 | 0 |
| 22.01.2024 20:00 - 21:00 | 0 | 0 | 0 | 0 |
| 22.01.2024 21:00 - 22:00 | 0 | 0 | 0 | 0 |
| 22.01.2024 22:00 - 23:00 | 0 | 0 | 0 | 0 |
| 22.01.2024 23:00 - 24:00 | 0 | 0 | 0 | 0 |
| 23.01.2024 00:00 - 01:00 | 0 | 0 | 0 | 0 |
| 23.01.2024 01:00 - 02:00 | 0 | 0 | 0 | 0 |
| 23.01.2024 02:00 - 03:00 | 0 | 0 | 0 | 0 |
| 23.01.2024 03:00 - 04:00 | 0 | -40 | 0 | 0 |
| 23.01.2024 04:00 - 05:00 | 0 | -40 | 0 | 0 |
| 23.01.2024 05:00 - 06:00 | 0 | -40 | 0 | 0 |
| 23.01.2024 06:00 - 07:00 | 0 | 0 | 0 | 0 |
| 23.01.2024 07:00 - 08:00 | 0 | 0 | 0 | 0 |
| 23.01.2024 08:00 - 09:00 | 0 | 0 | 0 | 0 |
| 23.01.2024 09:00 - 10:00 | 0 | 0 | 0 | 0 |
| 23.01.2024 10:00 - 11:00 | 0 | 0 | 0 | 0 |
| 23.01.2024 11:00 - 12:00 | 0 | 0 | 0 | 0 |
| 23.01.2024 12:00 - 13:00 | 0 | 0 | 0 | 0 |
| 23.01.2024 13:00 - 14:00 | 0 | 0 | 0 | 0 |
| 23.01.2024 14:00 - 15:00 | 0 | 0 | 0 | 0 |
| 23.01.2024 15:00 - 16:00 | 0 | 0 | 0 | 0 |
| 23.01.2024 16:00 - 17:00 | 0 | -40 | 0 | 0 |
| 23.01.2024 17:00 - 18:00 | 0 | -40 | 0 | 0 |
| 23.01.2024 18:00 - 19:00 | 0 | -40 | 0 | 0 |
| 23.01.2024 19:00 - 20:00 | 0 | -40 | 0 | 0 |
| 23.01.2024 20:00 - 21:00 | 0 | -40 | 0 | 0 |
| 23.01.2024 21:00 - 22:00 | 0 | -40 | 0 | 0 |
| 23.01.2024 22:00 - 23:00 | 0 | -40 | 0 | 0 |
| 23.01.2024 23:00 - 24:00 | 0 | -140 | 0 | 0 |
| 24.01.2024 00:00 - 01:00 | 0 | -140 | 0 | 0 |
| 24.01.2024 01:00 - 02:00 | 0 | -340 | 0 | 0 |
| 24.01.2024 02:00 - 03:00 | 0 | -340 | 0 | 0 |
| 24.01.2024 03:00 - 04:00 | 0 | -340 | 0 | 0 |
| 24.01.2024 04:00 - 05:00 | 0 | -340 | 0 | 0 |
| 24.01.2024 05:00 - 06:00 | 0 | -340 | 0 | 0 |
| 24.01.2024 06:00 - 07:00 | 0 | 0 | 0 | 0 |
| 24.01.2024 07:00 - 08:00 | 0 | 0 | 0 | 0 |
| 24.01.2024 08:00 - 09:00 | 0 | 0 | 0 | 0 |
| 24.01.2024 09:00 - 10:00 | 0 | 0 | 0 | 0 |
| 24.01.2024 10:00 - 11:00 | 0 | 0 | 0 | 0 |
| 24.01.2024 11:00 - 12:00 | 0 | 0 | 0 | 0 |
| 24.01.2024 12:00 - 13:00 | 0 | 0 | 0 | 0 |
| 24.01.2024 13:00 - 14:00 | 0 | 0 | 0 | 0 |
| 24.01.2024 14:00 - 15:00 | 0 | 0 | 0 | 0 |
| 24.01.2024 15:00 - 16:00 | 0 | 0 | 0 | 0 |
| 24.01.2024 16:00 - 17:00 | 0 | 0 | 0 | 0 |
| 24.01.2024 17:00 - 18:00 | 0 | 0 | 0 | 0 |
| 24.01.2024 18:00 - 19:00 | 0 | 0 | 0 | 0 |
| 24.01.2024 19:00 - 20:00 | 0 | 0 | 0 | 0 |
| 24.01.2024 20:00 - 21:00 | 0 | 0 | 0 | 0 |
| 24.01.2024 21:00 - 22:00 | 0 | -50 | 0 | 0 |
| 24.01.2024 22:00 - 23:00 | 0 | -50 | 0 | 0 |
| 24.01.2024 23:00 - 24:00 | 0 | -100 | 0 | 0 |
| 25.01.2024 00:00 - 01:00 | 0 | -200 | 0 | 0 |
| 25.01.2024 01:00 - 02:00 | 0 | -250 | 0 | 0 |
| 25.01.2024 02:00 - 03:00 | 0 | -250 | 0 | 0 |
| 25.01.2024 03:00 - 04:00 | 0 | -250 | 0 | 0 |
| 25.01.2024 04:00 - 05:00 | 0 | -250 | 0 | 0 |
| 25.01.2024 05:00 - 06:00 | 0 | -250 | 0 | 0 |
| 25.01.2024 06:00 - 07:00 | 0 | 0 | 0 | 0 |
| 25.01.2024 07:00 - 08:00 | 0 | 0 | 0 | 0 |
| 25.01.2024 08:00 - 09:00 | 0 | 0 | 0 | 0 |
| 25.01.2024 09:00 - 10:00 | 0 | 0 | 0 | 0 |
| 25.01.2024 10:00 - 11:00 | 0 | 0 | 0 | 0 |
| 25.01.2024 11:00 - 12:00 | 0 | 0 | 0 | 0 |
| 25.01.2024 12:00 - 13:00 | 0 | 0 | 0 | 0 |
| 25.01.2024 13:00 - 14:00 | 0 | 0 | 0 | 0 |
| 25.01.2024 14:00 - 15:00 | 0 | 0 | 0 | 0 |
| 25.01.2024 15:00 - 16:00 | 0 | 0 | 0 | 0 |
| 25.01.2024 16:00 - 17:00 | 0 | 0 | 0 | 0 |
| 25.01.2024 17:00 - 18:00 | 0 | 0 | 0 | 0 |
| 25.01.2024 18:00 - 19:00 | 0 | 0 | 0 | 0 |
| 25.01.2024 19:00 - 20:00 | 0 | -60 | 0 | 0 |
| 25.01.2024 20:00 - 21:00 | 0 | -60 | 0 | 0 |
| 25.01.2024 21:00 - 22:00 | 0 | -120 | 0 | 0 |
| 25.01.2024 22:00 - 23:00 | 0 | -120 | 0 | 0 |
| 25.01.2024 23:00 - 24:00 | 0 | -120 | 0 | 0 |
| 26.01.2024 00:00 - 01:00 | 0 | -180 | 0 | 0 |
| 26.01.2024 01:00 - 02:00 | 0 | -180 | 0 | 0 |
| 26.01.2024 02:00 - 03:00 | 0 | -230 | 0 | 0 |
| 26.01.2024 03:00 - 04:00 | 0 | -230 | 0 | 0 |
| 26.01.2024 04:00 - 05:00 | 0 | -230 | 0 | 0 |
| 26.01.2024 05:00 - 06:00 | 0 | -230 | 0 | 0 |
| 26.01.2024 06:00 - 07:00 | 0 | 0 | 0 | 0 |
| 26.01.2024 07:00 - 08:00 | 0 | 0 | 0 | 0 |
| 26.01.2024 08:00 - 09:00 | 0 | 0 | 0 | 0 |
| 26.01.2024 09:00 - 10:00 | 0 | 0 | 0 | 0 |
| 26.01.2024 10:00 - 11:00 | 0 | 0 | 0 | 0 |
| 26.01.2024 11:00 - 12:00 | 0 | 0 | 0 | 0 |
| 26.01.2024 12:00 - 13:00 | 0 | 0 | 0 | 0 |
| 26.01.2024 13:00 - 14:00 | 0 | 0 | 0 | 0 |
| 26.01.2024 14:00 - 15:00 | 0 | 0 | 0 | 0 |
| 26.01.2024 15:00 - 16:00 | 0 | 0 | 0 | 0 |
| 26.01.2024 16:00 - 17:00 | 0 | 0 | 0 | 0 |
| 26.01.2024 17:00 - 18:00 | 0 | 0 | 0 | 0 |
| 26.01.2024 18:00 - 19:00 | 0 | 0 | 0 | 0 |
| 26.01.2024 19:00 - 20:00 | 0 | -60 | 0 | 0 |
| 26.01.2024 20:00 - 21:00 | 0 | -60 | 0 | 0 |
| 26.01.2024 21:00 - 22:00 | 0 | -60 | 0 | 0 |
| 26.01.2024 22:00 - 23:00 | 0 | -120 | 0 | 0 |
| 26.01.2024 23:00 - 24:00 | 0 | -120 | 0 | 0 |
| 27.01.2024 00:00 - 01:00 | 0 | -210 | 0 | 0 |
| 27.01.2024 01:00 - 02:00 | 0 | -210 | 0 | 0 |
| 27.01.2024 02:00 - 03:00 | 0 | -360 | 0 | 0 |
| 27.01.2024 03:00 - 04:00 | 0 | -360 | 0 | 0 |
| 27.01.2024 04:00 - 05:00 | 0 | -360 | 0 | 0 |
| 27.01.2024 05:00 - 06:00 | 0 | -360 | 0 | 0 |
| 27.01.2024 06:00 - 07:00 | 0 | 0 | 0 | 0 |
| 27.01.2024 07:00 - 08:00 | 0 | 0 | 0 | 0 |
| 27.01.2024 08:00 - 09:00 | 0 | 0 | 0 | 0 |
| 27.01.2024 09:00 - 10:00 | 0 | 0 | 0 | 0 |
| 27.01.2024 10:00 - 11:00 | 0 | 0 | 0 | 0 |
| 27.01.2024 11:00 - 12:00 | 0 | 0 | 0 | 0 |
| 27.01.2024 12:00 - 13:00 | 0 | 0 | 0 | 0 |
| 27.01.2024 13:00 - 14:00 | 0 | 0 | 0 | 0 |
| 27.01.2024 14:00 - 15:00 | 0 | 0 | 0 | 0 |
| 27.01.2024 15:00 - 16:00 | 0 | 0 | 0 | 0 |
| 27.01.2024 16:00 - 17:00 | 0 | 0 | 0 | 0 |
| 27.01.2024 17:00 - 18:00 | 0 | 0 | 0 | 0 |
| 27.01.2024 18:00 - 19:00 | 0 | 0 | 0 | 0 |
| 27.01.2024 19:00 - 20:00 | 0 | 0 | 0 | 0 |
| 27.01.2024 20:00 - 21:00 | 0 | 0 | 0 | 0 |
| 27.01.2024 21:00 - 22:00 | 0 | 0 | 0 | 0 |
| 27.01.2024 22:00 - 23:00 | 0 | 0 | 0 | 0 |
| 27.01.2024 23:00 - 24:00 | 0 | 0 | 0 | 0 |
| 28.01.2024 00:00 - 01:00 | 0 | 0 | 0 | 0 |
| 28.01.2024 01:00 - 02:00 | 0 | 0 | 0 | 0 |
| 28.01.2024 02:00 - 03:00 | 0 | 0 | 0 | 0 |
| 28.01.2024 03:00 - 04:00 | 0 | 0 | 0 | 0 |
| 28.01.2024 04:00 - 05:00 | 0 | 0 | 0 | 0 |
| 28.01.2024 05:00 - 06:00 | 0 | 0 | 0 | 0 |
| 28.01.2024 06:00 - 07:00 | 0 | 0 | 0 | 0 |
| 28.01.2024 07:00 - 08:00 | 0 | 0 | 0 | 0 |
| 28.01.2024 08:00 - 09:00 | 0 | 0 | 0 | 0 |
| 28.01.2024 09:00 - 10:00 | 0 | 0 | 0 | 0 |
| 28.01.2024 10:00 - 11:00 | 0 | 0 | 0 | 0 |
| 28.01.2024 11:00 - 12:00 | 0 | 0 | 0 | 0 |
| 28.01.2024 12:00 - 13:00 | 0 | 0 | 0 | 0 |
| 28.01.2024 13:00 - 14:00 | 0 | 0 | 0 | 0 |
| 28.01.2024 14:00 - 15:00 | 0 | 0 | 0 | 0 |
| 28.01.2024 15:00 - 16:00 | 0 | 0 | 0 | 0 |
| 28.01.2024 16:00 - 17:00 | 0 | 0 | 0 | 0 |
| 28.01.2024 17:00 - 18:00 | 0 | 0 | 0 | 0 |
| 28.01.2024 18:00 - 19:00 | 0 | 0 | 0 | 0 |
| 28.01.2024 19:00 - 20:00 | 0 | 0 | 0 | 0 |
| 28.01.2024 20:00 - 21:00 | 0 | 0 | 0 | 0 |
| 28.01.2024 21:00 - 22:00 | 0 | 0 | 0 | 0 |
| 28.01.2024 22:00 - 23:00 | 0 | 0 | 0 | 0 |
| 28.01.2024 23:00 - 24:00 | 0 | 0 | 0 | 0 |
| 29.01.2024 00:00 - 01:00 | 0 | 0 | 0 | 0 |
| 29.01.2024 01:00 - 02:00 | 0 | 0 | 0 | 0 |
| 29.01.2024 02:00 - 03:00 | 0 | 0 | 0 | 0 |
| 29.01.2024 03:00 - 04:00 | 0 | 0 | 0 | 0 |
| 29.01.2024 04:00 - 05:00 | 0 | 0 | 0 | 0 |
| 29.01.2024 05:00 - 06:00 | 0 | 0 | 0 | 0 |
| 29.01.2024 06:00 - 07:00 | 0 | 0 | 0 | 0 |
| 29.01.2024 07:00 - 08:00 | 0 | 0 | 0 | 0 |
| 29.01.2024 08:00 - 09:00 | 0 | 0 | 0 | 0 |
| 29.01.2024 09:00 - 10:00 | 0 | 0 | 0 | 0 |
| 29.01.2024 10:00 - 11:00 | 0 | 0 | 0 | 0 |
| 29.01.2024 11:00 - 12:00 | 0 | 0 | 0 | 0 |
| 29.01.2024 12:00 - 13:00 | 0 | 0 | 0 | 0 |
| 29.01.2024 13:00 - 14:00 | 0 | 0 | 0 | 0 |
| 29.01.2024 14:00 - 15:00 | 0 | 0 | 0 | 0 |
| 29.01.2024 15:00 - 16:00 | 0 | 0 | 0 | 0 |
| 29.01.2024 16:00 - 17:00 | 0 | 0 | 0 | 0 |
| 29.01.2024 17:00 - 18:00 | 0 | 0 | 0 | 0 |
| 29.01.2024 18:00 - 19:00 | 0 | 0 | 0 | 0 |
| 29.01.2024 19:00 - 20:00 | 0 | 0 | 0 | 0 |
| 29.01.2024 20:00 - 21:00 | 0 | 0 | 0 | 0 |
| 29.01.2024 21:00 - 22:00 | 0 | 0 | 0 | 0 |
| 29.01.2024 22:00 - 23:00 | 0 | 0 | 0 | 0 |
| 29.01.2024 23:00 - 24:00 | 0 | 0 | 0 | 0 |
| 30.01.2024 00:00 - 01:00 | 0 | 0 | 0 | 0 |
| 30.01.2024 01:00 - 02:00 | 0 | 0 | 0 | 0 |
| 30.01.2024 02:00 - 03:00 | 0 | 0 | 0 | 0 |
| 30.01.2024 03:00 - 04:00 | 0 | 0 | 0 | 0 |
| 30.01.2024 04:00 - 05:00 | 0 | 0 | 0 | 0 |
| 30.01.2024 05:00 - 06:00 | 0 | 0 | 0 | 0 |
| 30.01.2024 06:00 - 07:00 | 0 | 0 | 0 | 0 |
| 30.01.2024 07:00 - 08:00 | 0 | 0 | 0 | 0 |
| 30.01.2024 08:00 - 09:00 | 0 | 0 | 0 | 0 |
| 30.01.2024 09:00 - 10:00 | 0 | 0 | 0 | 0 |
| 30.01.2024 10:00 - 11:00 | 0 | 0 | 0 | 0 |
| 30.01.2024 11:00 - 12:00 | 0 | 0 | 0 | 0 |
| 30.01.2024 12:00 - 13:00 | 0 | 0 | 0 | 0 |
| 30.01.2024 13:00 - 14:00 | 0 | 0 | 0 | 0 |
| 30.01.2024 14:00 - 15:00 | 0 | 0 | 0 | 0 |
| 30.01.2024 15:00 - 16:00 | 0 | 0 | 0 | 0 |
| 30.01.2024 16:00 - 17:00 | 0 | 0 | 0 | 0 |
| 30.01.2024 17:00 - 18:00 | 0 | 0 | 0 | 0 |
| 30.01.2024 18:00 - 19:00 | 0 | 0 | 0 | 0 |
| 30.01.2024 19:00 - 20:00 | 0 | 0 | 0 | 0 |
| 30.01.2024 20:00 - 21:00 | 0 | 0 | 0 | 0 |
| 30.01.2024 21:00 - 22:00 | 0 | -150 | 0 | 0 |
| 30.01.2024 22:00 - 23:00 | 0 | -150 | 0 | 0 |
| 30.01.2024 23:00 - 24:00 | 0 | -250 | 0 | 0 |
| 31.01.2024 00:00 - 01:00 | 0 | -250 | 0 | 0 |
| 31.01.2024 01:00 - 02:00 | 0 | -250 | 0 | 0 |
| 31.01.2024 02:00 - 03:00 | 0 | -310 | 0 | 0 |
| 31.01.2024 03:00 - 04:00 | 0 | -310 | 0 | 0 |
| 31.01.2024 04:00 - 05:00 | 0 | -310 | 0 | 0 |
| 31.01.2024 05:00 - 06:00 | 0 | -310 | 0 | 0 |
| 31.01.2024 06:00 - 07:00 | 0 | 0 | 0 | 0 |
| 31.01.2024 07:00 - 08:00 | 0 | 0 | 0 | 0 |
| 31.01.2024 08:00 - 09:00 | 0 | 0 | 0 | 0 |
| 31.01.2024 09:00 - 10:00 | 0 | 0 | 0 | 0 |
| 31.01.2024 10:00 - 11:00 | 0 | 0 | 0 | 0 |
| 31.01.2024 11:00 - 12:00 | 0 | 0 | 0 | 0 |
| 31.01.2024 12:00 - 13:00 | 0 | 0 | 0 | 0 |
| 31.01.2024 13:00 - 14:00 | 0 | 0 | 0 | 0 |
| 31.01.2024 14:00 - 15:00 | 0 | 0 | 0 | 0 |
| 31.01.2024 15:00 - 16:00 | 0 | 0 | 0 | 0 |
| 31.01.2024 16:00 - 17:00 | 0 | 0 | 0 | 0 |
| 31.01.2024 17:00 - 18:00 | 0 | 0 | 0 | 0 |
| 31.01.2024 18:00 - 19:00 | 0 | 0 | 0 | 0 |
| 31.01.2024 19:00 - 20:00 | 0 | 0 | 0 | 0 |
| 31.01.2024 20:00 - 21:00 | 0 | 0 | 0 | 0 |
| 31.01.2024 21:00 - 22:00 | 0 | 0 | 0 | 0 |
| 31.01.2024 22:00 - 23:00 | 0 | 0 | 0 | 0 |
| 31.01.2024 23:00 - 24:00 | 0 | 0 | 0 | 0 |
| 01.02.2024 00:00 - 01:00 | 0 | 0 | 0 | 0 |
| 01.02.2024 01:00 - 02:00 | 0 | 0 | 0 | 0 |
| 01.02.2024 02:00 - 03:00 | 0 | 0 | 0 | 0 |
| 01.02.2024 03:00 - 04:00 | 0 | 0 | 0 | 0 |
| 01.02.2024 04:00 - 05:00 | 0 | 0 | 0 | 0 |
| 01.02.2024 05:00 - 06:00 | 0 | 0 | 0 | 0 |